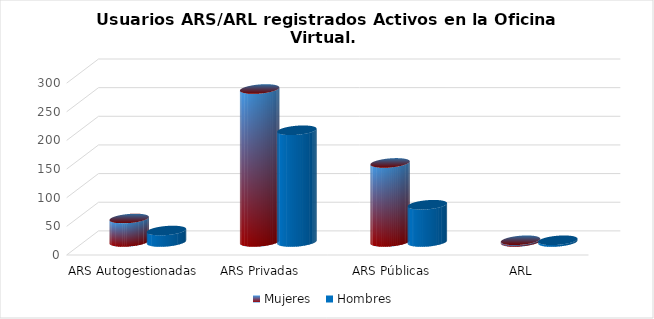
| Category | Mujeres | Hombres |
|---|---|---|
| ARS Autogestionadas | 41 | 20 |
| ARS Privadas | 267 | 195 |
| ARS Públicas | 138 | 65 |
| ARL | 3 | 3 |